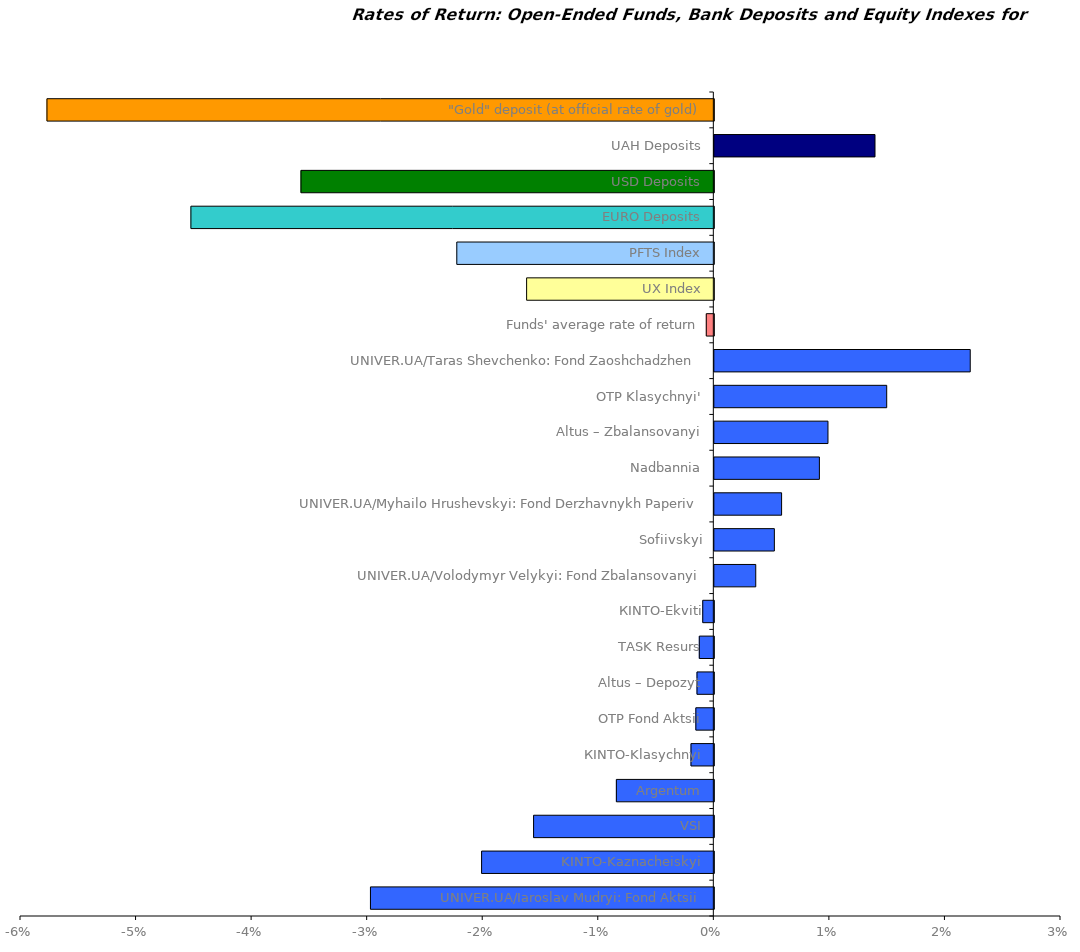
| Category | Series 0 |
|---|---|
| UNIVER.UA/Iaroslav Mudryi: Fond Aktsii | -0.03 |
| KINTO-Kaznacheiskyi | -0.02 |
| VSI | -0.016 |
| Argentum | -0.008 |
| КІNТО-Klasychnyi | -0.002 |
| OTP Fond Aktsii | -0.002 |
| Altus – Depozyt | -0.001 |
| ТАSK Resurs | -0.001 |
| КІNTO-Ekviti | -0.001 |
| UNIVER.UA/Volodymyr Velykyi: Fond Zbalansovanyi | 0.004 |
| Sofiivskyi | 0.005 |
| UNIVER.UA/Myhailo Hrushevskyi: Fond Derzhavnykh Paperiv | 0.006 |
| Nadbannia | 0.009 |
| Altus – Zbalansovanyi | 0.01 |
| OTP Klasychnyi' | 0.015 |
| UNIVER.UA/Taras Shevchenko: Fond Zaoshchadzhen | 0.022 |
| Funds' average rate of return | -0.001 |
| UX Index | -0.016 |
| PFTS Index | -0.022 |
| EURO Deposits | -0.045 |
| USD Deposits | -0.036 |
| UAH Deposits | 0.014 |
| "Gold" deposit (at official rate of gold) | -0.058 |